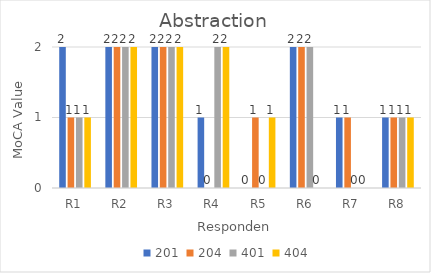
| Category | 201 | 204 | 401 | 404 |
|---|---|---|---|---|
| R1 | 2 | 1 | 1 | 1 |
| R2 | 2 | 2 | 2 | 2 |
| R3 | 2 | 2 | 2 | 2 |
| R4 | 1 | 0 | 2 | 2 |
| R5 | 0 | 1 | 0 | 1 |
| R6 | 2 | 2 | 2 | 0 |
| R7 | 1 | 1 | 0 | 0 |
| R8 | 1 | 1 | 1 | 1 |